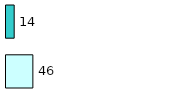
| Category | Series 0 | Series 1 |
|---|---|---|
| 0 | 46 | 14 |